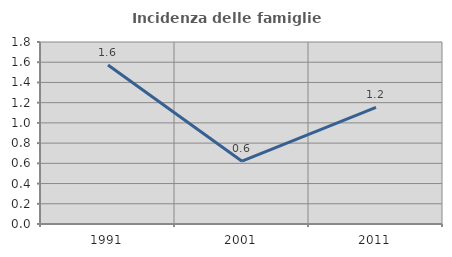
| Category | Incidenza delle famiglie numerose |
|---|---|
| 1991.0 | 1.573 |
| 2001.0 | 0.621 |
| 2011.0 | 1.154 |